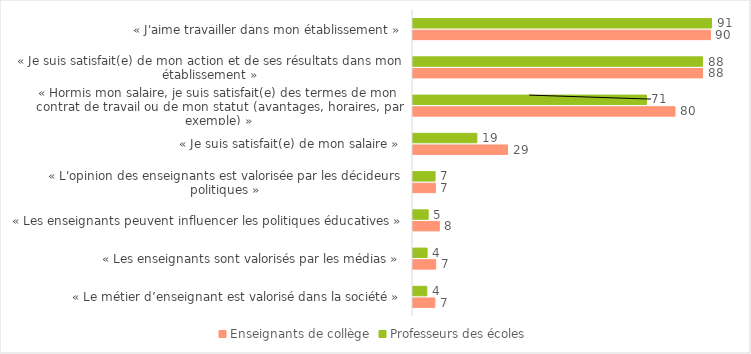
| Category | Enseignants de collège | Professeurs des écoles |
|---|---|---|
| « Le métier d’enseignant est valorisé dans la société » | 6.642 | 4.201 |
| « Les enseignants sont valorisés par les médias » | 6.888 | 4.292 |
| « Les enseignants peuvent influencer les politiques éducatives » | 7.999 | 4.609 |
| « L'opinion des enseignants est valorisée par les décideurs politiques » | 6.797 | 6.72 |
| « Je suis satisfait(e) de mon salaire » | 28.731 | 19.409 |
| « Hormis mon salaire, je suis satisfait(e) des termes de mon contrat de travail ou de mon statut (avantages, horaires, par exemple) » | 79.635 | 70.959 |
| « Je suis satisfait(e) de mon action et de ses résultats dans mon établissement » | 88 | 88 |
| « J'aime travailler dans mon établissement » | 90.41 | 90.735 |